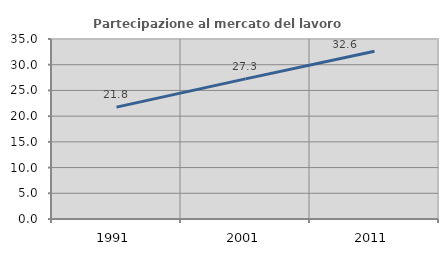
| Category | Partecipazione al mercato del lavoro  femminile |
|---|---|
| 1991.0 | 21.76 |
| 2001.0 | 27.252 |
| 2011.0 | 32.606 |